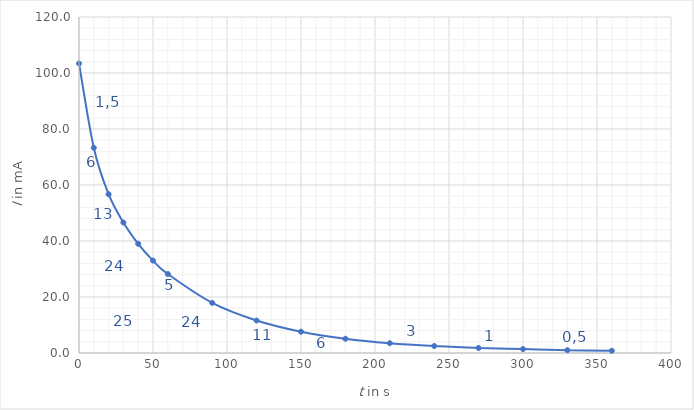
| Category | Series 0 |
|---|---|
| 0.0 | 103.4 |
| 10.0 | 73.3 |
| 20.0 | 56.7 |
| 30.0 | 46.6 |
| 40.0 | 39 |
| 50.0 | 33 |
| 60.0 | 28.2 |
| 90.0 | 17.9 |
| 120.0 | 11.6 |
| 150.0 | 7.6 |
| 180.0 | 5.1 |
| 210.0 | 3.5 |
| 240.0 | 2.5 |
| 270.0 | 1.8 |
| 300.0 | 1.4 |
| 330.0 | 1 |
| 360.0 | 0.8 |